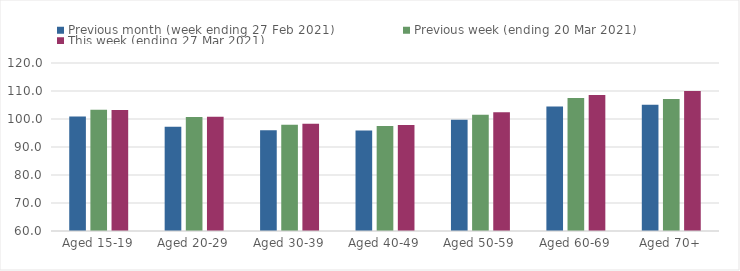
| Category | Previous month (week ending 27 Feb 2021) | Previous week (ending 20 Mar 2021) | This week (ending 27 Mar 2021) |
|---|---|---|---|
| Aged 15-19 | 100.85 | 103.32 | 103.17 |
| Aged 20-29 | 97.27 | 100.68 | 100.8 |
| Aged 30-39 | 96.01 | 97.99 | 98.26 |
| Aged 40-49 | 95.9 | 97.49 | 97.87 |
| Aged 50-59 | 99.73 | 101.55 | 102.39 |
| Aged 60-69 | 104.44 | 107.52 | 108.59 |
| Aged 70+ | 105.12 | 107.15 | 109.99 |